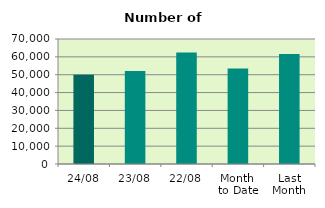
| Category | Series 0 |
|---|---|
| 24/08 | 49930 |
| 23/08 | 52080 |
| 22/08 | 62476 |
| Month 
to Date | 53429.889 |
| Last
Month | 61549.619 |